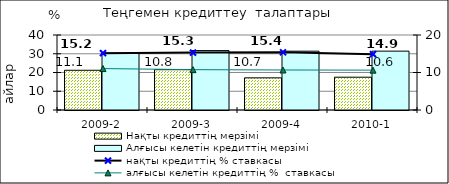
| Category | Нақты кредиттің мерзімі  | Алғысы келетін кредиттің мерзімі  |
|---|---|---|
| 2009-2 | 21.19 | 30.36 |
| 2009-3 | 21.5 | 31.7 |
| 2009-4 | 17.15 | 31.37 |
| 2010-1 | 17.5 | 31.4 |